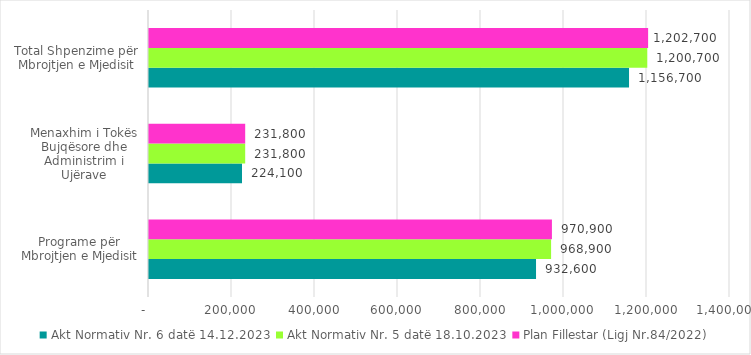
| Category | Akt Normativ Nr. 6 datë 14.12.2023 | Akt Normativ Nr. 5 datë 18.10.2023 | Plan Fillestar (Ligj Nr.84/2022) |
|---|---|---|---|
| Programe për Mbrojtjen e Mjedisit | 932600 | 968900 | 970900 |
| Menaxhim i Tokës Bujqësore dhe Administrim i Ujërave | 224100 | 231800 | 231800 |
| Total Shpenzime për Mbrojtjen e Mjedisit | 1156700 | 1200700 | 1202700 |